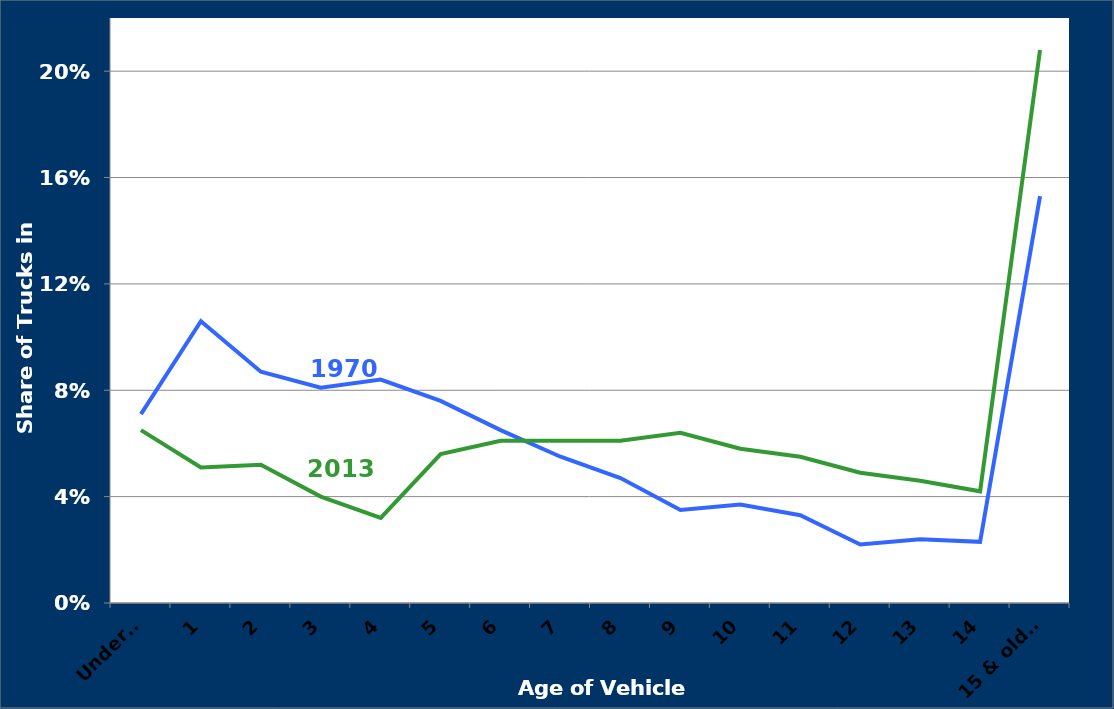
| Category | Series 0 | Series 2 |
|---|---|---|
| Under 1 | 0.071 | 0.065 |
| 1 | 0.106 | 0.051 |
| 2 | 0.087 | 0.052 |
| 3 | 0.081 | 0.04 |
| 4 | 0.084 | 0.032 |
| 5 | 0.076 | 0.056 |
| 6 | 0.065 | 0.061 |
| 7 | 0.055 | 0.061 |
| 8 | 0.047 | 0.061 |
| 9 | 0.035 | 0.064 |
| 10 | 0.037 | 0.058 |
| 11 | 0.033 | 0.055 |
| 12 | 0.022 | 0.049 |
| 13 | 0.024 | 0.046 |
| 14 | 0.023 | 0.042 |
| 15 & older | 0.153 | 0.208 |